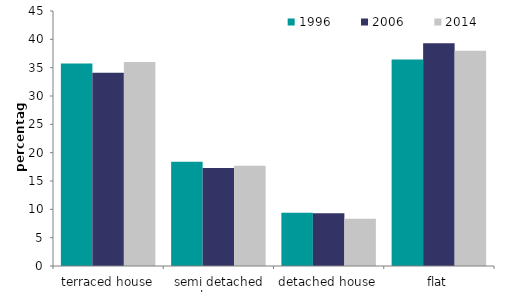
| Category | 1996 | 2006 | 2014 |
|---|---|---|---|
| terraced house | 35.755 | 34.083 | 36.017 |
| semi detached house | 18.376 | 17.312 | 17.692 |
| detached house | 9.406 | 9.29 | 8.322 |
| flat | 36.462 | 39.316 | 37.968 |